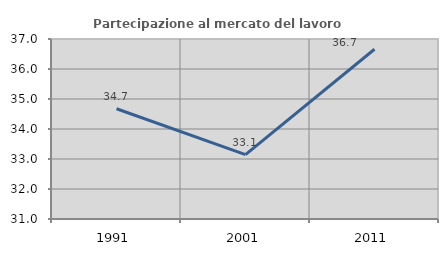
| Category | Partecipazione al mercato del lavoro  femminile |
|---|---|
| 1991.0 | 34.676 |
| 2001.0 | 33.147 |
| 2011.0 | 36.658 |